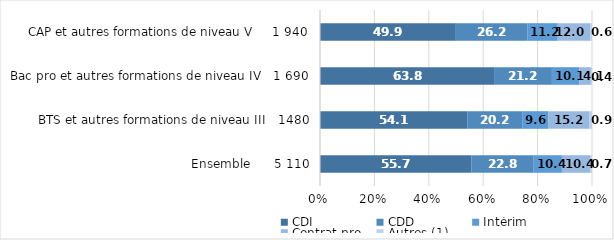
| Category | CDI | CDD | Intérim | Contrat pro | Autres (1) |
|---|---|---|---|---|---|
| Ensemble      5 110 | 55.736 | 22.827 | 10.376 | 10.356 | 0.705 |
| BTS et autres formations de niveau III   1480 | 54.133 | 20.19 | 9.553 | 15.244 | 0.881 |
| Bac pro et autres formations de niveau IV   1 690 | 63.803 | 21.209 | 10.13 | 4.147 | 0.415 |
| CAP et autres formations de niveau V     1 940 | 49.949 | 26.235 | 11.214 | 12.037 | 0.566 |